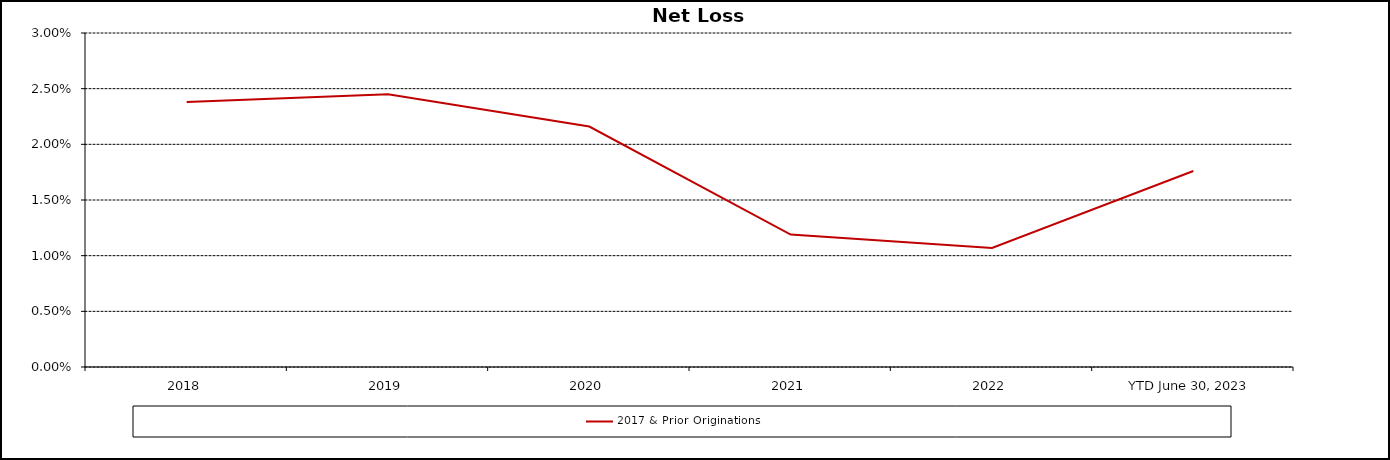
| Category | 2017 & Prior Originations |
|---|---|
| 2018 | 0.024 |
| 2019 | 0.024 |
| 2020 | 0.022 |
| 2021 | 0.012 |
| 2022 | 0.011 |
| YTD June 30, 2023 | 0.018 |